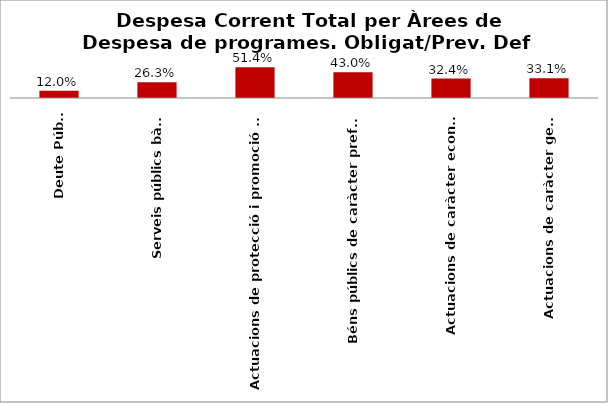
| Category | Series 0 |
|---|---|
| Deute Públic | 0.12 |
| Serveis públics bàsics | 0.263 |
| Actuacions de protecció i promoció social | 0.514 |
| Béns públics de caràcter preferent | 0.43 |
| Actuacions de caràcter econòmic | 0.324 |
| Actuacions de caràcter general | 0.331 |